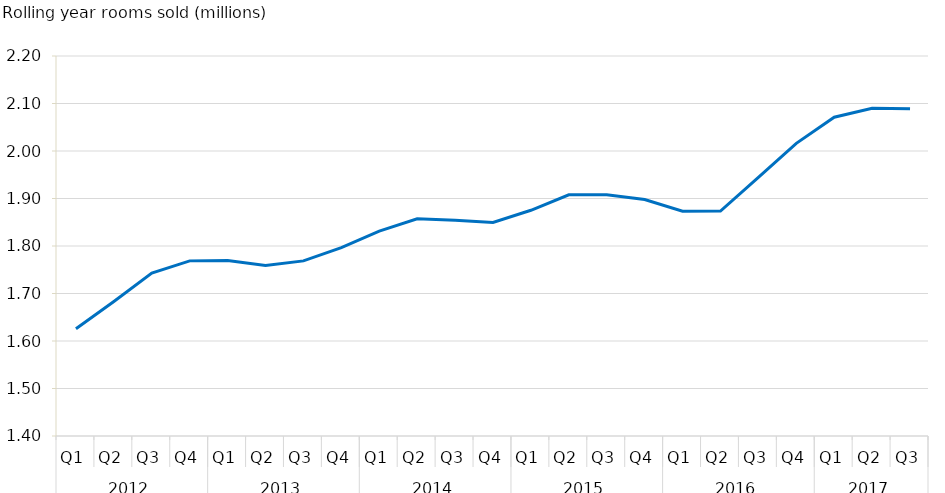
| Category | Series 0 |
|---|---|
| 0 | 1625798.175 |
| 1 | 1682986.282 |
| 2 | 1742794.791 |
| 3 | 1768685.123 |
| 4 | 1769588.225 |
| 5 | 1758950.115 |
| 6 | 1768672.827 |
| 7 | 1796703.317 |
| 8 | 1831335.384 |
| 9 | 1857225.461 |
| 10 | 1854028.286 |
| 11 | 1849521.422 |
| 12 | 1875195.63 |
| 13 | 1907646.356 |
| 14 | 1907929.166 |
| 15 | 1897876.32 |
| 16 | 1873411.233 |
| 17 | 1873676.965 |
| 18 | 1944377.589 |
| 19 | 2016024.39 |
| 20 | 2071104.899 |
| 21 | 2089776.154 |
| 22 | 2089082.619 |